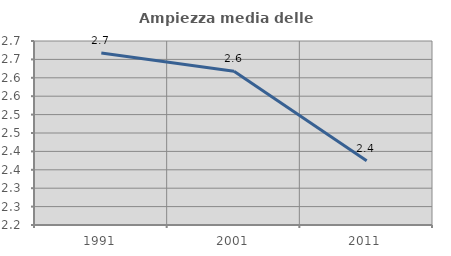
| Category | Ampiezza media delle famiglie |
|---|---|
| 1991.0 | 2.667 |
| 2001.0 | 2.618 |
| 2011.0 | 2.374 |